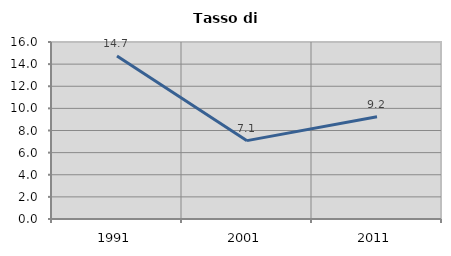
| Category | Tasso di disoccupazione   |
|---|---|
| 1991.0 | 14.733 |
| 2001.0 | 7.083 |
| 2011.0 | 9.239 |